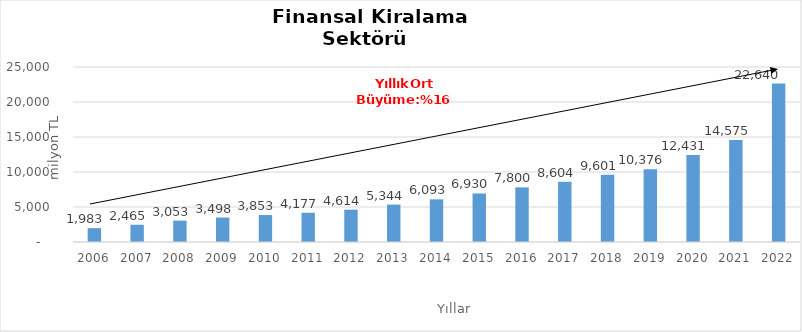
| Category | Finansal Kiralama  |
|---|---|
| 2006.0 | 1982.831 |
| 2007.0 | 2465.488 |
| 2008.0 | 3052.714 |
| 2009.0 | 3497.62 |
| 2010.0 | 3853.173 |
| 2011.0 | 4177.309 |
| 2012.0 | 4614.29 |
| 2013.0 | 5344.41 |
| 2014.0 | 6093 |
| 2015.0 | 6930 |
| 2016.0 | 7800 |
| 2017.0 | 8604 |
| 2018.0 | 9601 |
| 2019.0 | 10376 |
| 2020.0 | 12431 |
| 2021.0 | 14575 |
| 2022.0 | 22640 |